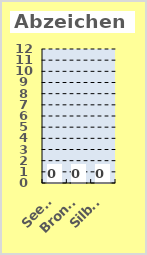
| Category | Series 0 |
|---|---|
| Seepf | 0 |
| Bronze | 0 |
| Silber | 0 |